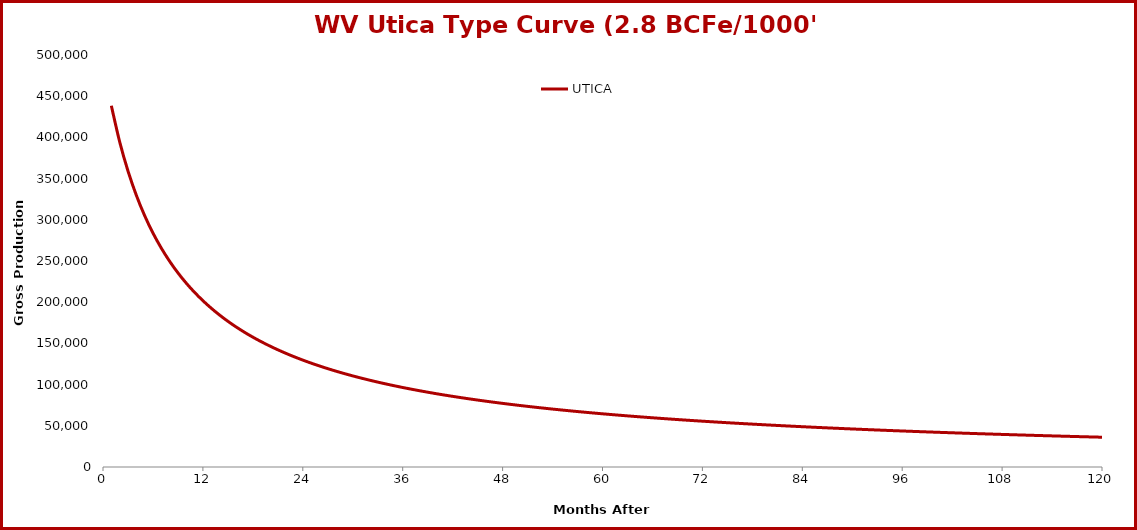
| Category | UTICA |
|---|---|
| 1.0 | 438470 |
| 2.0 | 394722 |
| 3.0 | 359240 |
| 4.0 | 329858 |
| 5.0 | 305109 |
| 6.0 | 283965 |
| 7.0 | 265680 |
| 8.0 | 249706 |
| 9.0 | 235624 |
| 10.0 | 223113 |
| 11.0 | 211920 |
| 12.0 | 201845 |
| 13.0 | 192726 |
| 14.0 | 184432 |
| 15.0 | 176853 |
| 16.0 | 169900 |
| 17.0 | 163498 |
| 18.0 | 157582 |
| 19.0 | 152098 |
| 20.0 | 147001 |
| 21.0 | 142249 |
| 22.0 | 137809 |
| 23.0 | 133650 |
| 24.0 | 129747 |
| 25.0 | 126075 |
| 26.0 | 122615 |
| 27.0 | 119349 |
| 28.0 | 116260 |
| 29.0 | 113335 |
| 30.0 | 110559 |
| 31.0 | 107923 |
| 32.0 | 105416 |
| 33.0 | 103028 |
| 34.0 | 100750 |
| 35.0 | 98576 |
| 36.0 | 96498 |
| 37.0 | 94510 |
| 38.0 | 92606 |
| 39.0 | 90781 |
| 40.0 | 89030 |
| 41.0 | 87348 |
| 42.0 | 85732 |
| 43.0 | 84177 |
| 44.0 | 82680 |
| 45.0 | 81238 |
| 46.0 | 79848 |
| 47.0 | 78507 |
| 48.0 | 77213 |
| 49.0 | 75962 |
| 50.0 | 74753 |
| 51.0 | 73584 |
| 52.0 | 72453 |
| 53.0 | 71357 |
| 54.0 | 70296 |
| 55.0 | 69268 |
| 56.0 | 68270 |
| 57.0 | 67302 |
| 58.0 | 66363 |
| 59.0 | 65451 |
| 60.0 | 64564 |
| 61.0 | 63703 |
| 62.0 | 62865 |
| 63.0 | 62050 |
| 64.0 | 61257 |
| 65.0 | 60485 |
| 66.0 | 59733 |
| 67.0 | 59000 |
| 68.0 | 58287 |
| 69.0 | 57591 |
| 70.0 | 56912 |
| 71.0 | 56250 |
| 72.0 | 55603 |
| 73.0 | 54972 |
| 74.0 | 54356 |
| 75.0 | 53755 |
| 76.0 | 53167 |
| 77.0 | 52592 |
| 78.0 | 52031 |
| 79.0 | 51482 |
| 80.0 | 50944 |
| 81.0 | 50419 |
| 82.0 | 49905 |
| 83.0 | 49401 |
| 84.0 | 48909 |
| 85.0 | 48426 |
| 86.0 | 47953 |
| 87.0 | 47490 |
| 88.0 | 47036 |
| 89.0 | 46591 |
| 90.0 | 46155 |
| 91.0 | 45728 |
| 92.0 | 45308 |
| 93.0 | 44897 |
| 94.0 | 44493 |
| 95.0 | 44097 |
| 96.0 | 43709 |
| 97.0 | 43327 |
| 98.0 | 42952 |
| 99.0 | 42584 |
| 100.0 | 42223 |
| 101.0 | 41868 |
| 102.0 | 41519 |
| 103.0 | 41177 |
| 104.0 | 40840 |
| 105.0 | 40509 |
| 106.0 | 40183 |
| 107.0 | 39863 |
| 108.0 | 39548 |
| 109.0 | 39239 |
| 110.0 | 38934 |
| 111.0 | 38635 |
| 112.0 | 38340 |
| 113.0 | 38050 |
| 114.0 | 37764 |
| 115.0 | 37483 |
| 116.0 | 37206 |
| 117.0 | 36934 |
| 118.0 | 36665 |
| 119.0 | 36401 |
| 120.0 | 36141 |
| 121.0 | 35884 |
| 122.0 | 35632 |
| 123.0 | 35383 |
| 124.0 | 35138 |
| 125.0 | 34896 |
| 126.0 | 34657 |
| 127.0 | 34423 |
| 128.0 | 34191 |
| 129.0 | 33963 |
| 130.0 | 33738 |
| 131.0 | 33515 |
| 132.0 | 33296 |
| 133.0 | 33080 |
| 134.0 | 32867 |
| 135.0 | 32657 |
| 136.0 | 32450 |
| 137.0 | 32245 |
| 138.0 | 32043 |
| 139.0 | 31844 |
| 140.0 | 31647 |
| 141.0 | 31453 |
| 142.0 | 31261 |
| 143.0 | 31072 |
| 144.0 | 30885 |
| 145.0 | 30700 |
| 146.0 | 30518 |
| 147.0 | 30338 |
| 148.0 | 30160 |
| 149.0 | 29985 |
| 150.0 | 29811 |
| 151.0 | 29640 |
| 152.0 | 29470 |
| 153.0 | 29303 |
| 154.0 | 29138 |
| 155.0 | 28974 |
| 156.0 | 28813 |
| 157.0 | 28653 |
| 158.0 | 28496 |
| 159.0 | 28340 |
| 160.0 | 28186 |
| 161.0 | 28033 |
| 162.0 | 27882 |
| 163.0 | 27733 |
| 164.0 | 27586 |
| 165.0 | 27440 |
| 166.0 | 27296 |
| 167.0 | 27154 |
| 168.0 | 27013 |
| 169.0 | 26873 |
| 170.0 | 26735 |
| 171.0 | 26598 |
| 172.0 | 26461 |
| 173.0 | 26325 |
| 174.0 | 26189 |
| 175.0 | 26055 |
| 176.0 | 25921 |
| 177.0 | 25787 |
| 178.0 | 25655 |
| 179.0 | 25523 |
| 180.0 | 25392 |
| 181.0 | 25261 |
| 182.0 | 25131 |
| 183.0 | 25002 |
| 184.0 | 24873 |
| 185.0 | 24745 |
| 186.0 | 24618 |
| 187.0 | 24491 |
| 188.0 | 24366 |
| 189.0 | 24240 |
| 190.0 | 24116 |
| 191.0 | 23992 |
| 192.0 | 23868 |
| 193.0 | 23745 |
| 194.0 | 23623 |
| 195.0 | 23502 |
| 196.0 | 23381 |
| 197.0 | 23261 |
| 198.0 | 23141 |
| 199.0 | 23022 |
| 200.0 | 22904 |
| 201.0 | 22786 |
| 202.0 | 22669 |
| 203.0 | 22552 |
| 204.0 | 22436 |
| 205.0 | 22321 |
| 206.0 | 22206 |
| 207.0 | 22092 |
| 208.0 | 21978 |
| 209.0 | 21865 |
| 210.0 | 21753 |
| 211.0 | 21641 |
| 212.0 | 21529 |
| 213.0 | 21419 |
| 214.0 | 21309 |
| 215.0 | 21199 |
| 216.0 | 21090 |
| 217.0 | 20981 |
| 218.0 | 20874 |
| 219.0 | 20766 |
| 220.0 | 20659 |
| 221.0 | 20553 |
| 222.0 | 20447 |
| 223.0 | 20342 |
| 224.0 | 20238 |
| 225.0 | 20134 |
| 226.0 | 20030 |
| 227.0 | 19927 |
| 228.0 | 19824 |
| 229.0 | 19723 |
| 230.0 | 19621 |
| 231.0 | 19520 |
| 232.0 | 19420 |
| 233.0 | 19320 |
| 234.0 | 19221 |
| 235.0 | 19122 |
| 236.0 | 19023 |
| 237.0 | 18926 |
| 238.0 | 18828 |
| 239.0 | 18731 |
| 240.0 | 18635 |
| 241.0 | 18539 |
| 242.0 | 18444 |
| 243.0 | 18349 |
| 244.0 | 18255 |
| 245.0 | 18161 |
| 246.0 | 18067 |
| 247.0 | 17974 |
| 248.0 | 17882 |
| 249.0 | 17790 |
| 250.0 | 17699 |
| 251.0 | 17607 |
| 252.0 | 17517 |
| 253.0 | 17427 |
| 254.0 | 17337 |
| 255.0 | 17248 |
| 256.0 | 17159 |
| 257.0 | 17071 |
| 258.0 | 16983 |
| 259.0 | 16896 |
| 260.0 | 16809 |
| 261.0 | 16723 |
| 262.0 | 16637 |
| 263.0 | 16551 |
| 264.0 | 16466 |
| 265.0 | 16381 |
| 266.0 | 16297 |
| 267.0 | 16213 |
| 268.0 | 16130 |
| 269.0 | 16047 |
| 270.0 | 15964 |
| 271.0 | 15882 |
| 272.0 | 15800 |
| 273.0 | 15719 |
| 274.0 | 15638 |
| 275.0 | 15558 |
| 276.0 | 15478 |
| 277.0 | 15398 |
| 278.0 | 15319 |
| 279.0 | 15240 |
| 280.0 | 15162 |
| 281.0 | 15084 |
| 282.0 | 15006 |
| 283.0 | 14929 |
| 284.0 | 14852 |
| 285.0 | 14776 |
| 286.0 | 14700 |
| 287.0 | 14624 |
| 288.0 | 14549 |
| 289.0 | 14474 |
| 290.0 | 14400 |
| 291.0 | 14326 |
| 292.0 | 14252 |
| 293.0 | 14179 |
| 294.0 | 14106 |
| 295.0 | 14033 |
| 296.0 | 13961 |
| 297.0 | 13890 |
| 298.0 | 13818 |
| 299.0 | 13747 |
| 300.0 | 13676 |
| 301.0 | 13606 |
| 302.0 | 13536 |
| 303.0 | 13466 |
| 304.0 | 13397 |
| 305.0 | 13328 |
| 306.0 | 13260 |
| 307.0 | 13191 |
| 308.0 | 13124 |
| 309.0 | 13056 |
| 310.0 | 12989 |
| 311.0 | 12922 |
| 312.0 | 12856 |
| 313.0 | 12790 |
| 314.0 | 12724 |
| 315.0 | 12658 |
| 316.0 | 12593 |
| 317.0 | 12529 |
| 318.0 | 12464 |
| 319.0 | 12400 |
| 320.0 | 12336 |
| 321.0 | 12273 |
| 322.0 | 12210 |
| 323.0 | 12147 |
| 324.0 | 12084 |
| 325.0 | 12022 |
| 326.0 | 11960 |
| 327.0 | 11899 |
| 328.0 | 11838 |
| 329.0 | 11777 |
| 330.0 | 11716 |
| 331.0 | 11656 |
| 332.0 | 11596 |
| 333.0 | 11536 |
| 334.0 | 11477 |
| 335.0 | 11418 |
| 336.0 | 11359 |
| 337.0 | 11301 |
| 338.0 | 11243 |
| 339.0 | 11185 |
| 340.0 | 11127 |
| 341.0 | 11070 |
| 342.0 | 11013 |
| 343.0 | 10957 |
| 344.0 | 10900 |
| 345.0 | 10844 |
| 346.0 | 10788 |
| 347.0 | 10733 |
| 348.0 | 10678 |
| 349.0 | 10623 |
| 350.0 | 10568 |
| 351.0 | 10514 |
| 352.0 | 10460 |
| 353.0 | 10406 |
| 354.0 | 10352 |
| 355.0 | 10299 |
| 356.0 | 10246 |
| 357.0 | 10194 |
| 358.0 | 10141 |
| 359.0 | 10089 |
| 360.0 | 10037 |
| 361.0 | 9985 |
| 362.0 | 9934 |
| 363.0 | 9883 |
| 364.0 | 9832 |
| 365.0 | 9782 |
| 366.0 | 9731 |
| 367.0 | 9681 |
| 368.0 | 9631 |
| 369.0 | 9582 |
| 370.0 | 9533 |
| 371.0 | 9484 |
| 372.0 | 9435 |
| 373.0 | 9386 |
| 374.0 | 9338 |
| 375.0 | 9290 |
| 376.0 | 9242 |
| 377.0 | 9195 |
| 378.0 | 9147 |
| 379.0 | 9100 |
| 380.0 | 9054 |
| 381.0 | 9007 |
| 382.0 | 8961 |
| 383.0 | 8915 |
| 384.0 | 8869 |
| 385.0 | 8823 |
| 386.0 | 8778 |
| 387.0 | 8733 |
| 388.0 | 8688 |
| 389.0 | 8643 |
| 390.0 | 8599 |
| 391.0 | 8554 |
| 392.0 | 8510 |
| 393.0 | 8467 |
| 394.0 | 8423 |
| 395.0 | 8380 |
| 396.0 | 8337 |
| 397.0 | 8294 |
| 398.0 | 8251 |
| 399.0 | 8209 |
| 400.0 | 8166 |
| 401.0 | 8124 |
| 402.0 | 8083 |
| 403.0 | 8041 |
| 404.0 | 8000 |
| 405.0 | 7959 |
| 406.0 | 7918 |
| 407.0 | 7877 |
| 408.0 | 7836 |
| 409.0 | 7796 |
| 410.0 | 7756 |
| 411.0 | 7716 |
| 412.0 | 7676 |
| 413.0 | 7637 |
| 414.0 | 7598 |
| 415.0 | 7559 |
| 416.0 | 7520 |
| 417.0 | 7481 |
| 418.0 | 7443 |
| 419.0 | 7404 |
| 420.0 | 7366 |
| 421.0 | 7328 |
| 422.0 | 7291 |
| 423.0 | 7253 |
| 424.0 | 7216 |
| 425.0 | 7179 |
| 426.0 | 7142 |
| 427.0 | 7105 |
| 428.0 | 7069 |
| 429.0 | 7032 |
| 430.0 | 6996 |
| 431.0 | 6960 |
| 432.0 | 6924 |
| 433.0 | 6889 |
| 434.0 | 6853 |
| 435.0 | 6818 |
| 436.0 | 6783 |
| 437.0 | 6748 |
| 438.0 | 6713 |
| 439.0 | 6679 |
| 440.0 | 6644 |
| 441.0 | 6610 |
| 442.0 | 6576 |
| 443.0 | 6542 |
| 444.0 | 6509 |
| 445.0 | 6475 |
| 446.0 | 6442 |
| 447.0 | 6409 |
| 448.0 | 6376 |
| 449.0 | 6343 |
| 450.0 | 6311 |
| 451.0 | 6278 |
| 452.0 | 6246 |
| 453.0 | 6214 |
| 454.0 | 6182 |
| 455.0 | 6150 |
| 456.0 | 6118 |
| 457.0 | 6087 |
| 458.0 | 6056 |
| 459.0 | 6024 |
| 460.0 | 5993 |
| 461.0 | 5963 |
| 462.0 | 5932 |
| 463.0 | 5901 |
| 464.0 | 5871 |
| 465.0 | 5841 |
| 466.0 | 5811 |
| 467.0 | 5781 |
| 468.0 | 5751 |
| 469.0 | 5722 |
| 470.0 | 5692 |
| 471.0 | 5663 |
| 472.0 | 5634 |
| 473.0 | 5605 |
| 474.0 | 5576 |
| 475.0 | 5547 |
| 476.0 | 5519 |
| 477.0 | 5490 |
| 478.0 | 5462 |
| 479.0 | 5434 |
| 480.0 | 5406 |
| 481.0 | 5378 |
| 482.0 | 5351 |
| 483.0 | 5323 |
| 484.0 | 5296 |
| 485.0 | 5269 |
| 486.0 | 5241 |
| 487.0 | 5214 |
| 488.0 | 5188 |
| 489.0 | 5161 |
| 490.0 | 5134 |
| 491.0 | 5108 |
| 492.0 | 5082 |
| 493.0 | 5056 |
| 494.0 | 5030 |
| 495.0 | 5004 |
| 496.0 | 4978 |
| 497.0 | 4952 |
| 498.0 | 4927 |
| 499.0 | 4902 |
| 500.0 | 4876 |
| 501.0 | 4851 |
| 502.0 | 4826 |
| 503.0 | 4802 |
| 504.0 | 4777 |
| 505.0 | 4752 |
| 506.0 | 4728 |
| 507.0 | 4704 |
| 508.0 | 4679 |
| 509.0 | 4655 |
| 510.0 | 4631 |
| 511.0 | 4608 |
| 512.0 | 4584 |
| 513.0 | 4560 |
| 514.0 | 4537 |
| 515.0 | 4513 |
| 516.0 | 4490 |
| 517.0 | 4467 |
| 518.0 | 4444 |
| 519.0 | 4421 |
| 520.0 | 4399 |
| 521.0 | 4376 |
| 522.0 | 4353 |
| 523.0 | 4331 |
| 524.0 | 4309 |
| 525.0 | 4287 |
| 526.0 | 4265 |
| 527.0 | 4243 |
| 528.0 | 4221 |
| 529.0 | 4199 |
| 530.0 | 4178 |
| 531.0 | 4156 |
| 532.0 | 4135 |
| 533.0 | 4113 |
| 534.0 | 4092 |
| 535.0 | 4071 |
| 536.0 | 4050 |
| 537.0 | 4029 |
| 538.0 | 4009 |
| 539.0 | 3988 |
| 540.0 | 3968 |
| 541.0 | 3947 |
| 542.0 | 3927 |
| 543.0 | 3907 |
| 544.0 | 3887 |
| 545.0 | 3867 |
| 546.0 | 3847 |
| 547.0 | 3827 |
| 548.0 | 3807 |
| 549.0 | 3788 |
| 550.0 | 3768 |
| 551.0 | 3749 |
| 552.0 | 3730 |
| 553.0 | 3710 |
| 554.0 | 3691 |
| 555.0 | 3672 |
| 556.0 | 3653 |
| 557.0 | 3635 |
| 558.0 | 3616 |
| 559.0 | 3597 |
| 560.0 | 3579 |
| 561.0 | 3560 |
| 562.0 | 3542 |
| 563.0 | 3524 |
| 564.0 | 3506 |
| 565.0 | 3488 |
| 566.0 | 3470 |
| 567.0 | 3452 |
| 568.0 | 3434 |
| 569.0 | 3417 |
| 570.0 | 3399 |
| 571.0 | 3381 |
| 572.0 | 3364 |
| 573.0 | 3347 |
| 574.0 | 3330 |
| 575.0 | 3312 |
| 576.0 | 3295 |
| 577.0 | 3278 |
| 578.0 | 3262 |
| 579.0 | 3245 |
| 580.0 | 3228 |
| 581.0 | 3212 |
| 582.0 | 3195 |
| 583.0 | 3179 |
| 584.0 | 3162 |
| 585.0 | 3146 |
| 586.0 | 3130 |
| 587.0 | 3114 |
| 588.0 | 3098 |
| 589.0 | 3082 |
| 590.0 | 3066 |
| 591.0 | 3050 |
| 592.0 | 3034 |
| 593.0 | 3019 |
| 594.0 | 3003 |
| 595.0 | 2988 |
| 596.0 | 2973 |
| 597.0 | 2957 |
| 598.0 | 2942 |
| 599.0 | 2927 |
| 600.0 | 2912 |
| 601.0 | 2897 |
| 602.0 | 2882 |
| 603.0 | 2867 |
| 604.0 | 2852 |
| 605.0 | 2838 |
| 606.0 | 2823 |
| 607.0 | 2809 |
| 608.0 | 2794 |
| 609.0 | 2780 |
| 610.0 | 2765 |
| 611.0 | 2751 |
| 612.0 | 2737 |
| 613.0 | 2723 |
| 614.0 | 2709 |
| 615.0 | 2695 |
| 616.0 | 2681 |
| 617.0 | 2667 |
| 618.0 | 2654 |
| 619.0 | 2640 |
| 620.0 | 2627 |
| 621.0 | 2613 |
| 622.0 | 2600 |
| 623.0 | 2586 |
| 624.0 | 2573 |
| 625.0 | 2560 |
| 626.0 | 2546 |
| 627.0 | 2533 |
| 628.0 | 2520 |
| 629.0 | 2507 |
| 630.0 | 2495 |
| 631.0 | 2482 |
| 632.0 | 2469 |
| 633.0 | 2456 |
| 634.0 | 2444 |
| 635.0 | 2431 |
| 636.0 | 2419 |
| 637.0 | 2406 |
| 638.0 | 2394 |
| 639.0 | 2381 |
| 640.0 | 2369 |
| 641.0 | 2357 |
| 642.0 | 2345 |
| 643.0 | 2333 |
| 644.0 | 2321 |
| 645.0 | 2309 |
| 646.0 | 2297 |
| 647.0 | 2285 |
| 648.0 | 2273 |
| 649.0 | 2262 |
| 650.0 | 2250 |
| 651.0 | 2239 |
| 652.0 | 2227 |
| 653.0 | 2216 |
| 654.0 | 2204 |
| 655.0 | 2193 |
| 656.0 | 2182 |
| 657.0 | 2170 |
| 658.0 | 2159 |
| 659.0 | 2148 |
| 660.0 | 2137 |
| 661.0 | 2126 |
| 662.0 | 2115 |
| 663.0 | 2104 |
| 664.0 | 2093 |
| 665.0 | 2083 |
| 666.0 | 2072 |
| 667.0 | 2061 |
| 668.0 | 2051 |
| 669.0 | 2040 |
| 670.0 | 2030 |
| 671.0 | 2019 |
| 672.0 | 2009 |
| 673.0 | 1998 |
| 674.0 | 1988 |
| 675.0 | 1978 |
| 676.0 | 1968 |
| 677.0 | 1958 |
| 678.0 | 1948 |
| 679.0 | 1938 |
| 680.0 | 1928 |
| 681.0 | 1918 |
| 682.0 | 1908 |
| 683.0 | 1898 |
| 684.0 | 1888 |
| 685.0 | 1879 |
| 686.0 | 1869 |
| 687.0 | 1859 |
| 688.0 | 1850 |
| 689.0 | 1840 |
| 690.0 | 1831 |
| 691.0 | 1821 |
| 692.0 | 1812 |
| 693.0 | 1803 |
| 694.0 | 1793 |
| 695.0 | 1784 |
| 696.0 | 1775 |
| 697.0 | 1766 |
| 698.0 | 1757 |
| 699.0 | 1748 |
| 700.0 | 1739 |
| 701.0 | 1730 |
| 702.0 | 1721 |
| 703.0 | 1712 |
| 704.0 | 1703 |
| 705.0 | 1694 |
| 706.0 | 1686 |
| 707.0 | 1677 |
| 708.0 | 1668 |
| 709.0 | 1660 |
| 710.0 | 1651 |
| 711.0 | 1643 |
| 712.0 | 1634 |
| 713.0 | 1626 |
| 714.0 | 1618 |
| 715.0 | 1609 |
| 716.0 | 1601 |
| 717.0 | 1593 |
| 718.0 | 1585 |
| 719.0 | 1576 |
| 720.0 | 1568 |
| 721.0 | 1560 |
| 722.0 | 1552 |
| 723.0 | 1544 |
| 724.0 | 1536 |
| 725.0 | 1528 |
| 726.0 | 1521 |
| 727.0 | 1513 |
| 728.0 | 1505 |
| 729.0 | 1497 |
| 730.0 | 1490 |
| 731.0 | 1482 |
| 732.0 | 1474 |
| 733.0 | 1467 |
| 734.0 | 1459 |
| 735.0 | 1452 |
| 736.0 | 1444 |
| 737.0 | 1437 |
| 738.0 | 1429 |
| 739.0 | 1422 |
| 740.0 | 1415 |
| 741.0 | 1407 |
| 742.0 | 1400 |
| 743.0 | 1393 |
| 744.0 | 1386 |
| 745.0 | 1379 |
| 746.0 | 1372 |
| 747.0 | 1365 |
| 748.0 | 1358 |
| 749.0 | 1351 |
| 750.0 | 1344 |
| 751.0 | 1337 |
| 752.0 | 1330 |
| 753.0 | 1323 |
| 754.0 | 1316 |
| 755.0 | 1309 |
| 756.0 | 1303 |
| 757.0 | 1296 |
| 758.0 | 1289 |
| 759.0 | 1283 |
| 760.0 | 1276 |
| 761.0 | 1269 |
| 762.0 | 1263 |
| 763.0 | 1256 |
| 764.0 | 1250 |
| 765.0 | 1244 |
| 766.0 | 1237 |
| 767.0 | 1231 |
| 768.0 | 1224 |
| 769.0 | 1218 |
| 770.0 | 1212 |
| 771.0 | 1206 |
| 772.0 | 1199 |
| 773.0 | 1193 |
| 774.0 | 1187 |
| 775.0 | 1181 |
| 776.0 | 1175 |
| 777.0 | 1169 |
| 778.0 | 1163 |
| 779.0 | 1157 |
| 780.0 | 1151 |